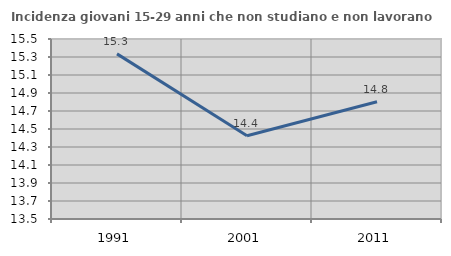
| Category | Incidenza giovani 15-29 anni che non studiano e non lavorano  |
|---|---|
| 1991.0 | 15.335 |
| 2001.0 | 14.425 |
| 2011.0 | 14.803 |